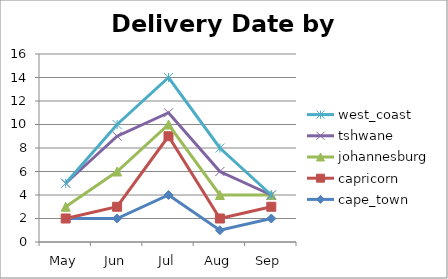
| Category | cape_town | capricorn | johannesburg | tshwane | west_coast |
|---|---|---|---|---|---|
| May | 2 | 0 | 1 | 2 | 0 |
| Jun | 2 | 1 | 3 | 3 | 1 |
| Jul | 4 | 5 | 1 | 1 | 3 |
| Aug | 1 | 1 | 2 | 2 | 2 |
| Sep | 2 | 1 | 1 | 0 | 0 |